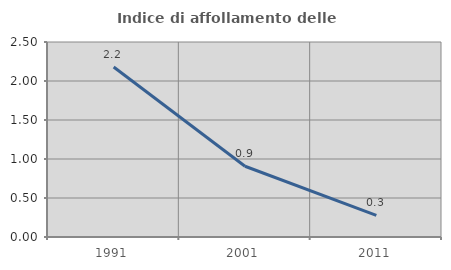
| Category | Indice di affollamento delle abitazioni  |
|---|---|
| 1991.0 | 2.179 |
| 2001.0 | 0.907 |
| 2011.0 | 0.277 |